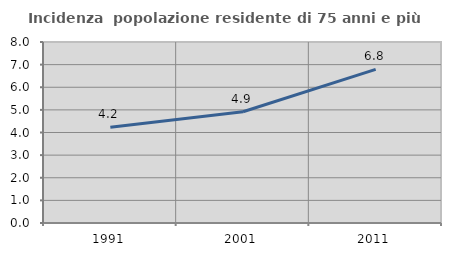
| Category | Incidenza  popolazione residente di 75 anni e più |
|---|---|
| 1991.0 | 4.237 |
| 2001.0 | 4.917 |
| 2011.0 | 6.788 |